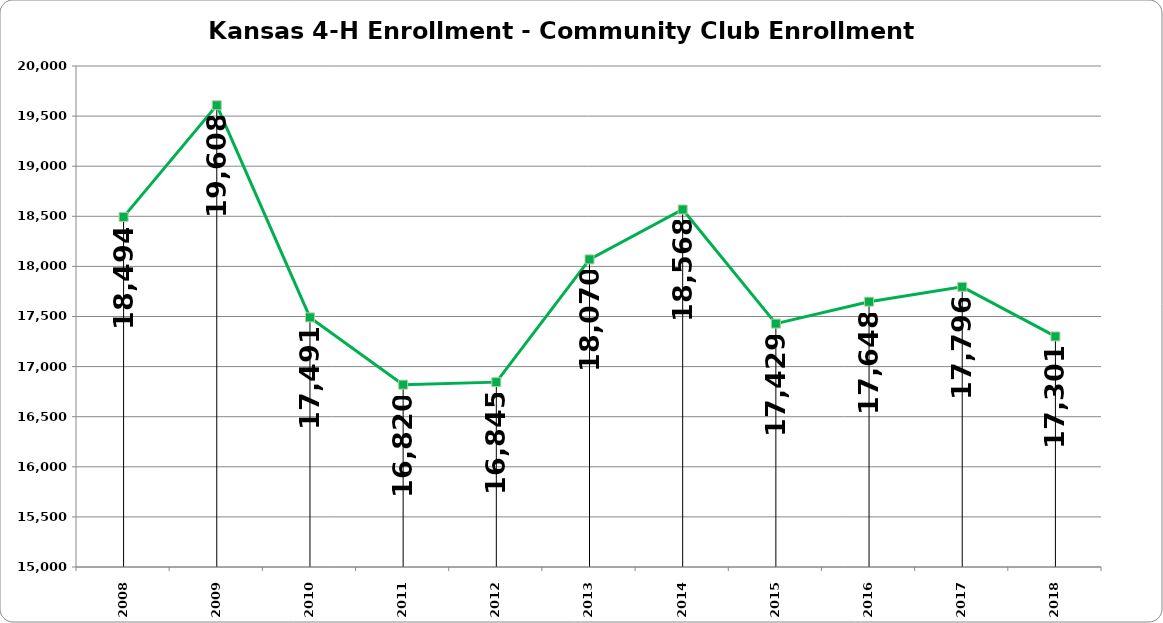
| Category | 4-H Community Clubs |
|---|---|
| 2008.0 | 18494 |
| 2009.0 | 19608 |
| 2010.0 | 17491 |
| 2011.0 | 16820 |
| 2012.0 | 16845 |
| 2013.0 | 18070 |
| 2014.0 | 18568 |
| 2015.0 | 17429 |
| 2016.0 | 17648 |
| 2017.0 | 17796 |
| 2018.0 | 17301 |